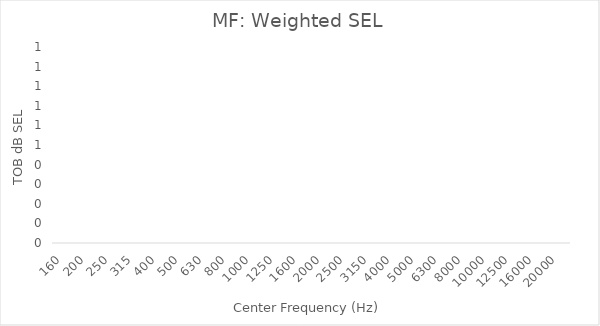
| Category | Series 0 |
|---|---|
| 160.0 | 0 |
| 200.0 | 0 |
| 250.0 | 0 |
| 315.0 | 0 |
| 400.0 | 0 |
| 500.0 | 0 |
| 630.0 | 0 |
| 800.0 | 0 |
| 1000.0 | 0 |
| 1250.0 | 0 |
| 1600.0 | 0 |
| 2000.0 | 0 |
| 2500.0 | 0 |
| 3150.0 | 0 |
| 4000.0 | 0 |
| 5000.0 | 0 |
| 6300.0 | 0 |
| 8000.0 | 0 |
| 10000.0 | 0 |
| 12500.0 | 0 |
| 16000.0 | 0 |
| 20000.0 | 0 |